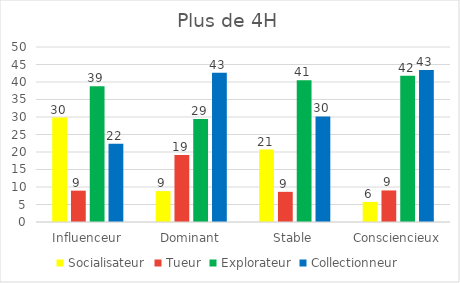
| Category | Socialisateur | Tueur | Explorateur | Collectionneur |
|---|---|---|---|---|
| Influenceur | 29.851 | 8.955 | 38.806 | 22.388 |
| Dominant | 8.824 | 19.118 | 29.412 | 42.647 |
| Stable | 20.69 | 8.621 | 40.517 | 30.172 |
| Consciencieux | 5.738 | 9.016 | 41.803 | 43.443 |